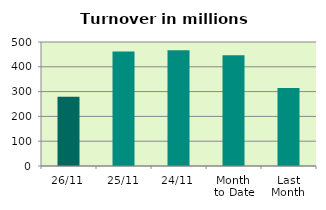
| Category | Series 0 |
|---|---|
| 26/11 | 279.599 |
| 25/11 | 461.714 |
| 24/11 | 467.181 |
| Month 
to Date | 446.38 |
| Last
Month | 314.143 |